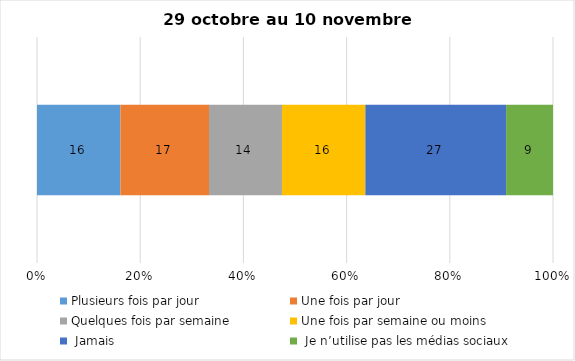
| Category | Plusieurs fois par jour | Une fois par jour | Quelques fois par semaine   | Une fois par semaine ou moins   |  Jamais   |  Je n’utilise pas les médias sociaux |
|---|---|---|---|---|---|---|
| 0 | 16 | 17 | 14 | 16 | 27 | 9 |